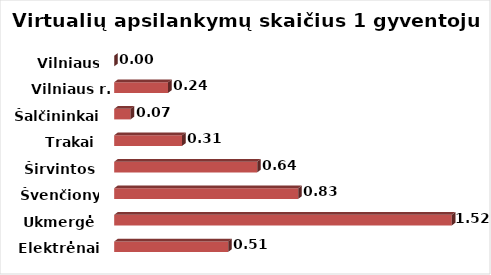
| Category | Series 0 |
|---|---|
| Elektrėnai | 0.513 |
| Ukmergė | 1.519 |
| Švenčionys | 0.828 |
| Širvintos | 0.643 |
| Trakai | 0.305 |
| Šalčininkai | 0.074 |
| Vilniaus r. | 0.243 |
| Vilniaus m. | 0 |